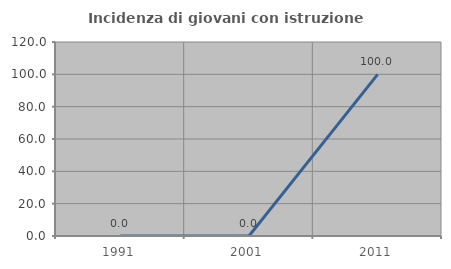
| Category | Incidenza di giovani con istruzione universitaria |
|---|---|
| 1991.0 | 0 |
| 2001.0 | 0 |
| 2011.0 | 100 |